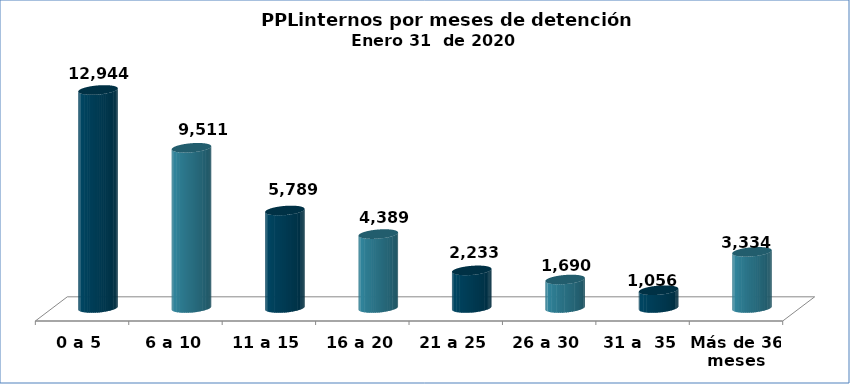
| Category | Series 0 |
|---|---|
| 0 a 5 | 12944 |
| 6 a 10 | 9511 |
| 11 a 15 | 5789 |
| 16 a 20 | 4389 |
| 21 a 25 | 2233 |
| 26 a 30 | 1690 |
| 31 a  35 | 1056 |
| Más de 36 meses | 3334 |